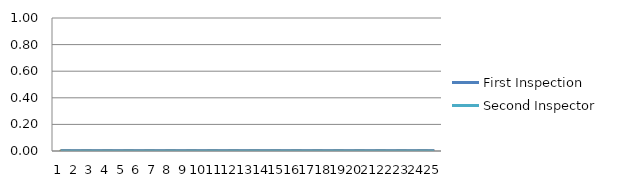
| Category | Mittelwert | untere Toleranz | obere Toleranz | First Inspection | Second Inspector |
|---|---|---|---|---|---|
| 0 | 0 | 0 | 0 | 0 | 0 |
| 1 | 0 | 0 | 0 | 0 | 0 |
| 2 | 0 | 0 | 0 | 0 | 0 |
| 3 | 0 | 0 | 0 | 0 | 0 |
| 4 | 0 | 0 | 0 | 0 | 0 |
| 5 | 0 | 0 | 0 | 0 | 0 |
| 6 | 0 | 0 | 0 | 0 | 0 |
| 7 | 0 | 0 | 0 | 0 | 0 |
| 8 | 0 | 0 | 0 | 0 | 0 |
| 9 | 0 | 0 | 0 | 0 | 0 |
| 10 | 0 | 0 | 0 | 0 | 0 |
| 11 | 0 | 0 | 0 | 0 | 0 |
| 12 | 0 | 0 | 0 | 0 | 0 |
| 13 | 0 | 0 | 0 | 0 | 0 |
| 14 | 0 | 0 | 0 | 0 | 0 |
| 15 | 0 | 0 | 0 | 0 | 0 |
| 16 | 0 | 0 | 0 | 0 | 0 |
| 17 | 0 | 0 | 0 | 0 | 0 |
| 18 | 0 | 0 | 0 | 0 | 0 |
| 19 | 0 | 0 | 0 | 0 | 0 |
| 20 | 0 | 0 | 0 | 0 | 0 |
| 21 | 0 | 0 | 0 | 0 | 0 |
| 22 | 0 | 0 | 0 | 0 | 0 |
| 23 | 0 | 0 | 0 | 0 | 0 |
| 24 | 0 | 0 | 0 | 0 | 0 |